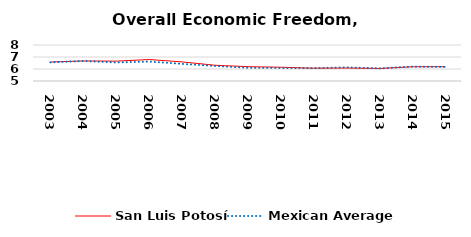
| Category | San Luis Potosí | Mexican Average  |
|---|---|---|
| 2003.0 | 6.582 | 6.552 |
| 2004.0 | 6.669 | 6.668 |
| 2005.0 | 6.655 | 6.546 |
| 2006.0 | 6.788 | 6.619 |
| 2007.0 | 6.591 | 6.428 |
| 2008.0 | 6.31 | 6.248 |
| 2009.0 | 6.193 | 6.106 |
| 2010.0 | 6.147 | 6.086 |
| 2011.0 | 6.067 | 6.074 |
| 2012.0 | 6.082 | 6.134 |
| 2013.0 | 6.045 | 6.054 |
| 2014.0 | 6.186 | 6.2 |
| 2015.0 | 6.192 | 6.174 |